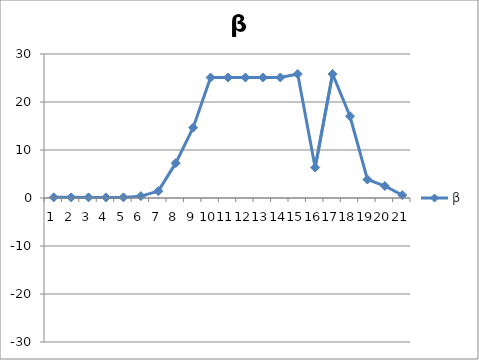
| Category | β |
|---|---|
| 0 | 0.137 |
| 1 | 0.132 |
| 2 | 0.127 |
| 3 | 0.125 |
| 4 | 0.124 |
| 5 | 0.39 |
| 6 | 1.437 |
| 7 | 7.258 |
| 8 | 14.656 |
| 9 | 25.106 |
| 10 | 25.106 |
| 11 | 25.106 |
| 12 | 25.106 |
| 13 | 25.106 |
| 14 | 25.835 |
| 15 | 6.348 |
| 16 | 25.835 |
| 17 | 17.035 |
| 18 | 3.859 |
| 19 | 2.5 |
| 20 | 0.6 |